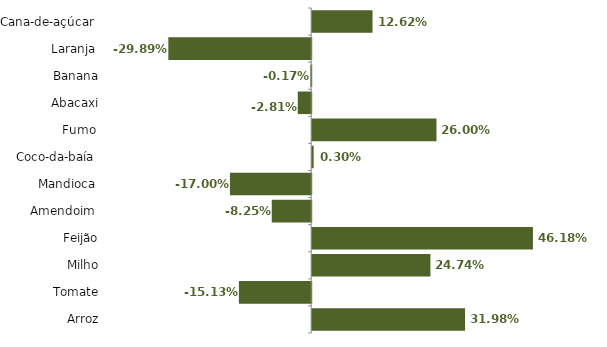
| Category | Series 0 |
|---|---|
| Cana-de-açúcar  | 0.126 |
| Laranja  | -0.299 |
| Banana | -0.002 |
| Abacaxi | -0.028 |
| Fumo  | 0.26 |
| Coco-da-baía  | 0.003 |
| Mandioca  | -0.17 |
| Amendoim  | -0.082 |
| Feijão | 0.462 |
| Milho | 0.247 |
| Tomate | -0.151 |
| Arroz | 0.32 |